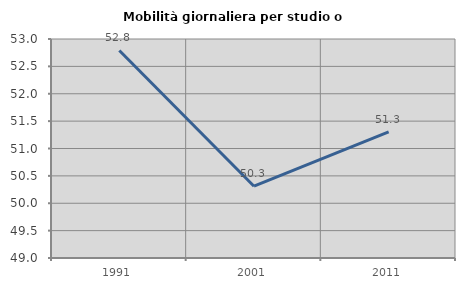
| Category | Mobilità giornaliera per studio o lavoro |
|---|---|
| 1991.0 | 52.79 |
| 2001.0 | 50.312 |
| 2011.0 | 51.303 |